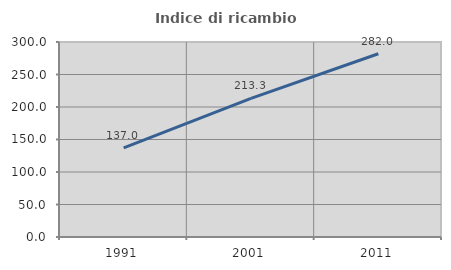
| Category | Indice di ricambio occupazionale  |
|---|---|
| 1991.0 | 136.995 |
| 2001.0 | 213.309 |
| 2011.0 | 281.984 |